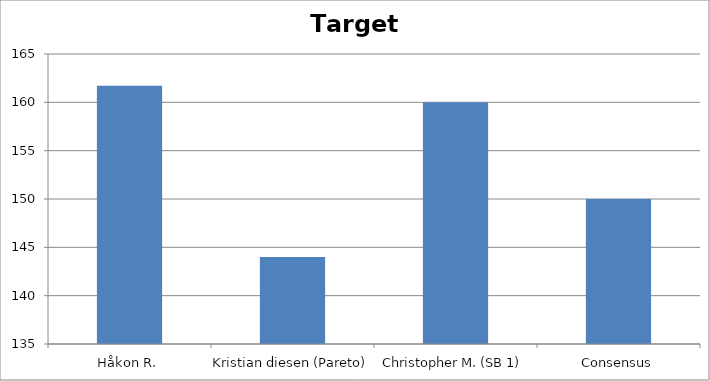
| Category | Target price |
|---|---|
| Håkon R. | 161.703 |
| Kristian diesen (Pareto) | 144 |
| Christopher M. (SB 1) | 160 |
| Consensus | 150 |